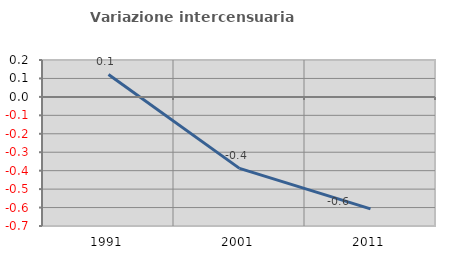
| Category | Variazione intercensuaria annua |
|---|---|
| 1991.0 | 0.121 |
| 2001.0 | -0.388 |
| 2011.0 | -0.607 |